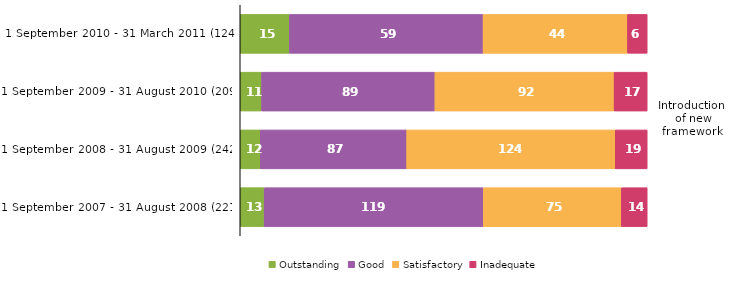
| Category | Outstanding | Good | Satisfactory | Inadequate |
|---|---|---|---|---|
| 1 September 2010 - 31 March 2011 (124) | 15 | 59 | 44 | 6 |
| 1 September 2009 - 31 August 2010 (209) | 11 | 89 | 92 | 17 |
| 1 September 2008 - 31 August 2009 (242) | 12 | 87 | 124 | 19 |
| 1 September 2007 - 31 August 2008 (221) | 13 | 119 | 75 | 14 |